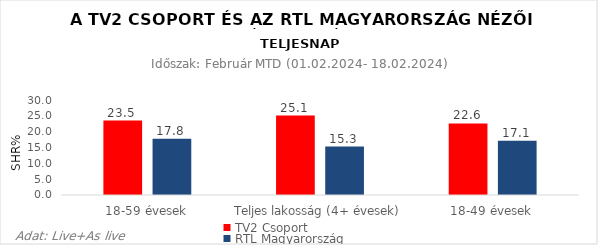
| Category | TV2 Csoport | RTL Magyarország |
|---|---|---|
| 18-59 évesek | 23.5 | 17.8 |
| Teljes lakosság (4+ évesek) | 25.1 | 15.3 |
| 18-49 évesek | 22.6 | 17.1 |